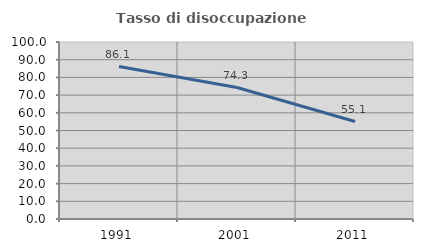
| Category | Tasso di disoccupazione giovanile  |
|---|---|
| 1991.0 | 86.119 |
| 2001.0 | 74.286 |
| 2011.0 | 55.068 |